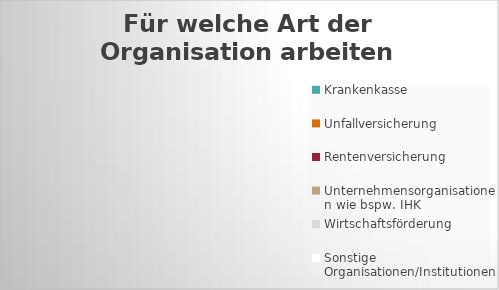
| Category | Für welche Art der Organisation arbeiten Sie? |
|---|---|
| Krankenkasse | 0 |
| Unfallversicherung | 0 |
| Rentenversicherung | 0 |
| Unternehmensorganisationen wie bspw. IHK | 0 |
| Wirtschaftsförderung | 0 |
| Sonstige Organisationen/Institutionen | 0 |